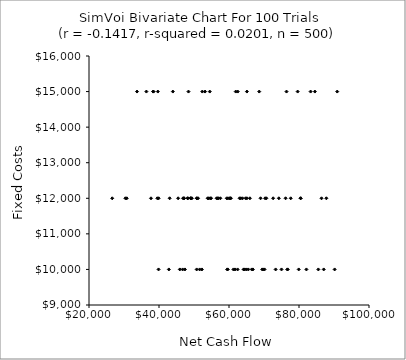
| Category | Series 0 |
|---|---|
| 48154.977217583066 | 12000 |
| 70682.51596479409 | 12000 |
| 86436.5420225312 | 12000 |
| 66834.48184401443 | 10000 |
| 77634.78412678391 | 12000 |
| 61919.69156738762 | 15000 |
| 70156.48960359007 | 10000 |
| 90184.72702924711 | 10000 |
| 47412.03063120171 | 10000 |
| 47153.82297423416 | 12000 |
| 70315.16078395753 | 12000 |
| 54893.18877706429 | 12000 |
| 59352.21812398874 | 12000 |
| 43958.34105482556 | 15000 |
| 57531.76421218569 | 12000 |
| 33721.52515674997 | 15000 |
| 39877.59826338139 | 10000 |
| 56752.994389964195 | 12000 |
| 72608.13298813373 | 12000 |
| 38446.16943664757 | 15000 |
| 60314.1827053593 | 12000 |
| 69834.56499417181 | 10000 |
| 64337.29943733051 | 10000 |
| 47130.56907554706 | 12000 |
| 38325.85133645695 | 15000 |
| 54219.642747983875 | 12000 |
| 48262.903444120406 | 12000 |
| 63352.32465664006 | 12000 |
| 60252.79794104138 | 12000 |
| 76166.65208670945 | 12000 |
| 76750.59733998531 | 10000 |
| 69012.14545992219 | 12000 |
| 79919.6168878054 | 10000 |
| 62504.38922290401 | 15000 |
| 65119.80775418579 | 15000 |
| 61264.20784551128 | 10000 |
| 30782.138242632733 | 12000 |
| 51160.15559836281 | 12000 |
| 43050.6036892064 | 12000 |
| 39518.391990074204 | 12000 |
| 54506.8366129497 | 15000 |
| 49043.35357984937 | 12000 |
| 90921.8678704726 | 15000 |
| 74244.3059296348 | 12000 |
| 37711.497301807656 | 12000 |
| 53905.23708398311 | 12000 |
| 82120.99361417707 | 10000 |
| 65974.25845446187 | 12000 |
| 52260.23134478972 | 10000 |
| 26633.522325595914 | 12000 |
| 66494.18093266759 | 10000 |
| 83312.58172655286 | 15000 |
| 59711.91548784729 | 12000 |
| 50778.427713971025 | 12000 |
| 52375.896013475955 | 15000 |
| 59511.3111831608 | 10000 |
| 30399.98168625337 | 12000 |
| 50832.5745551164 | 12000 |
| 56965.682830189384 | 12000 |
| 75000.89940822551 | 10000 |
| 36397.463767583315 | 15000 |
| 64164.308127635755 | 10000 |
| 53162.49106132139 | 15000 |
| 76683.56462035289 | 10000 |
| 80473.88928697901 | 12000 |
| 84532.35526339684 | 15000 |
| 46867.55294035408 | 12000 |
| 39668.01394907492 | 15000 |
| 69491.07617752672 | 10000 |
| 48421.042627684474 | 15000 |
| 59624.23058747544 | 10000 |
| 45949.3432467028 | 10000 |
| 42811.343717013704 | 10000 |
| 85524.03185049415 | 10000 |
| 56458.65201604321 | 12000 |
| 61718.99473382138 | 10000 |
| 45467.77841728845 | 12000 |
| 64909.654327798096 | 10000 |
| 49068.58371308889 | 12000 |
| 63024.92257023466 | 12000 |
| 76433.51148161334 | 15000 |
| 51620.01489270308 | 10000 |
| 39893.69821022398 | 12000 |
| 62462.52936968756 | 10000 |
| 79619.57845908559 | 15000 |
| 87814.65117612609 | 12000 |
| 54668.48657157927 | 12000 |
| 65126.774458932865 | 12000 |
| 63850.06819411562 | 12000 |
| 46750.59939898617 | 10000 |
| 87060.51842574339 | 10000 |
| 80461.87214440771 | 12000 |
| 50763.753905041885 | 10000 |
| 49094.7505282223 | 12000 |
| 68637.50571250387 | 15000 |
| 64732.77941082179 | 12000 |
| 73323.76729660372 | 10000 |
| 49394.48321932916 | 12000 |
| 60547.0956469481 | 12000 |
| 65516.21868994972 | 10000 |